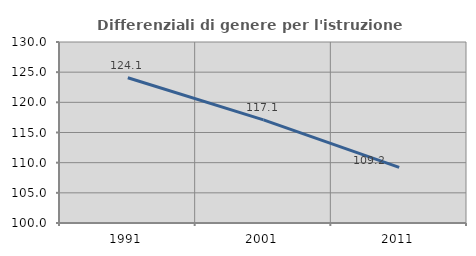
| Category | Differenziali di genere per l'istruzione superiore |
|---|---|
| 1991.0 | 124.069 |
| 2001.0 | 117.091 |
| 2011.0 | 109.233 |